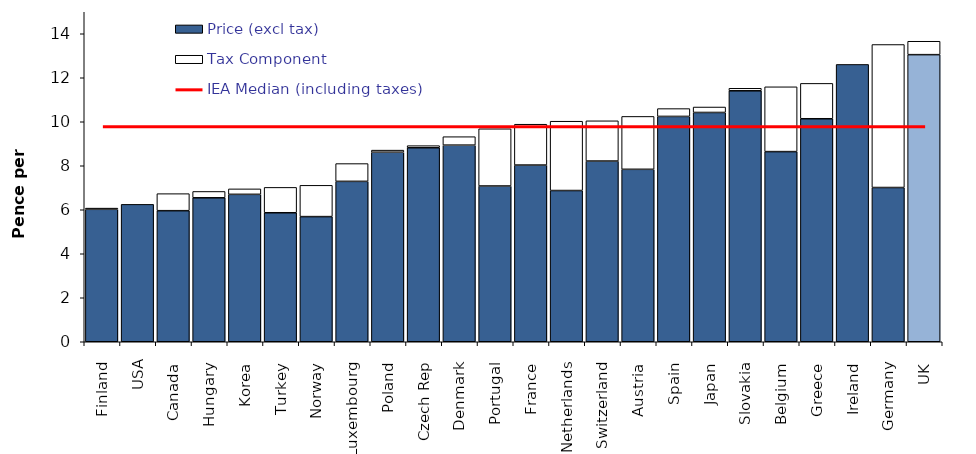
| Category | Price (excl tax) | Tax Component |
|---|---|---|
|  Finland  | 6.021 | 0.054 |
| USA | 6.245 | 0 |
|  Canada  | 5.958 | 0.774 |
|  Hungary  | 6.544 | 0.288 |
|  Korea  | 6.7 | 0.248 |
|  Turkey  | 5.864 | 1.153 |
|  Norway  | 5.688 | 1.422 |
|  Luxembourg  | 7.291 | 0.808 |
|  Poland  | 8.617 | 0.094 |
|  Czech Rep  | 8.819 | 0.095 |
|  Denmark  | 8.937 | 0.384 |
|  Portugal  | 7.08 | 2.601 |
|  France  | 8.032 | 1.856 |
|  Netherlands  | 6.874 | 3.151 |
|  Switzerland  | 8.214 | 1.829 |
|  Austria  | 7.839 | 2.404 |
|  Spain  | 10.242 | 0.356 |
|  Japan  | 10.422 | 0.248 |
|  Slovakia  | 11.407 | 0.114 |
|  Belgium  | 8.643 | 2.946 |
|  Greece  | 10.137 | 1.608 |
|  Ireland  | 12.606 | 0 |
|  Germany  | 7.011 | 6.5 |
|  UK  | 13.05 | 0.609 |